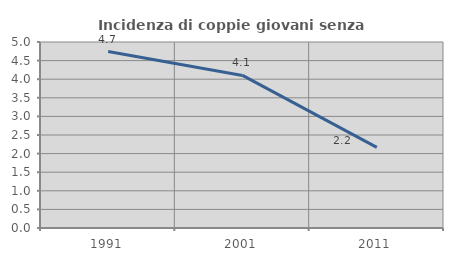
| Category | Incidenza di coppie giovani senza figli |
|---|---|
| 1991.0 | 4.742 |
| 2001.0 | 4.102 |
| 2011.0 | 2.167 |